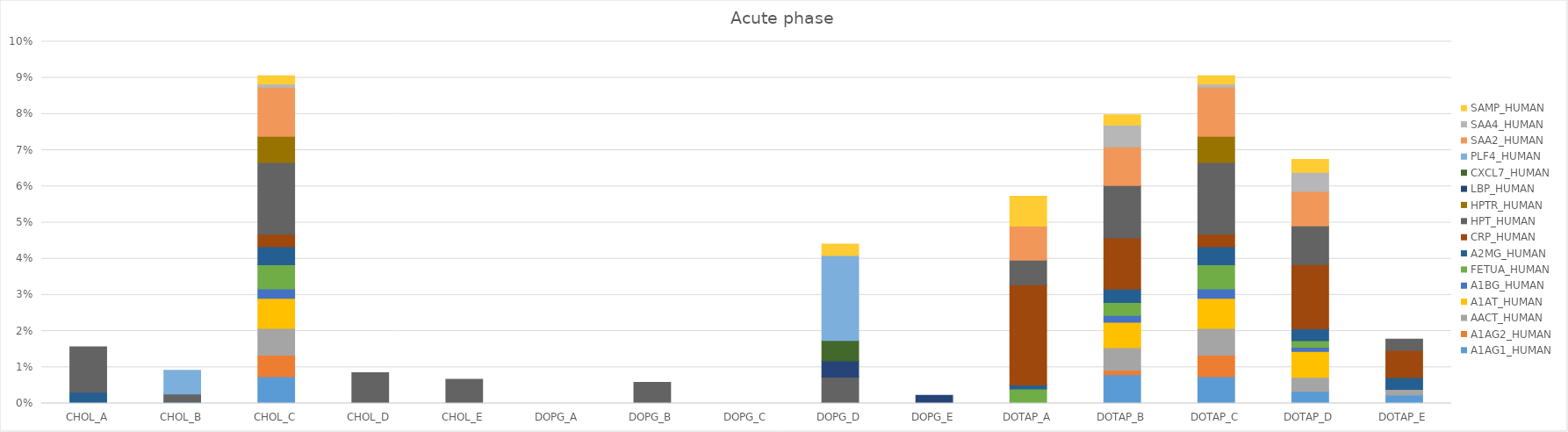
| Category | A1AG1_HUMAN | A1AG2_HUMAN | AACT_HUMAN | A1AT_HUMAN | A1BG_HUMAN | FETUA_HUMAN | A2MG_HUMAN | CRP_HUMAN | HPT_HUMAN | HPTR_HUMAN | LBP_HUMAN | CXCL7_HUMAN | PLF4_HUMAN | SAA2_HUMAN | SAA4_HUMAN | SAMP_HUMAN |
|---|---|---|---|---|---|---|---|---|---|---|---|---|---|---|---|---|
| CHOL_A | 0 | 0 | 0 | 0 | 0 | 0 | 0.003 | 0 | 0.013 | 0 | 0 | 0 | 0 | 0 | 0 | 0 |
| CHOL_B | 0 | 0 | 0 | 0 | 0 | 0 | 0 | 0 | 0.002 | 0 | 0 | 0 | 0.007 | 0 | 0 | 0 |
| CHOL_C | 0.007 | 0.006 | 0.007 | 0.008 | 0.003 | 0.007 | 0.005 | 0.003 | 0.02 | 0.007 | 0 | 0 | 0 | 0.014 | 0.001 | 0.002 |
| CHOL_D | 0 | 0 | 0 | 0 | 0 | 0 | 0 | 0 | 0.009 | 0 | 0 | 0 | 0 | 0 | 0 | 0 |
| CHOL_E | 0 | 0 | 0 | 0 | 0 | 0 | 0 | 0 | 0.007 | 0 | 0 | 0 | 0 | 0 | 0 | 0 |
| DOPG_A | 0 | 0 | 0 | 0 | 0 | 0 | 0 | 0 | 0 | 0 | 0 | 0 | 0 | 0 | 0 | 0 |
| DOPG_B | 0 | 0 | 0 | 0 | 0 | 0 | 0 | 0 | 0.006 | 0 | 0 | 0 | 0 | 0 | 0 | 0 |
| DOPG_C | 0 | 0 | 0 | 0 | 0 | 0 | 0 | 0 | 0 | 0 | 0 | 0 | 0 | 0 | 0 | 0 |
| DOPG_D | 0 | 0 | 0 | 0 | 0 | 0 | 0 | 0 | 0.007 | 0 | 0.004 | 0.006 | 0.023 | 0 | 0 | 0.003 |
| DOPG_E | 0 | 0 | 0 | 0 | 0 | 0 | 0 | 0 | 0 | 0 | 0.002 | 0 | 0 | 0 | 0 | 0 |
| DOTAP_A | 0 | 0 | 0 | 0 | 0 | 0.004 | 0.001 | 0.028 | 0.007 | 0 | 0 | 0 | 0 | 0.009 | 0 | 0.008 |
| DOTAP_B | 0.008 | 0.001 | 0.006 | 0.007 | 0.002 | 0.004 | 0.004 | 0.014 | 0.015 | 0 | 0 | 0 | 0 | 0.011 | 0.006 | 0.003 |
| DOTAP_C | 0.007 | 0.006 | 0.007 | 0.008 | 0.003 | 0.007 | 0.005 | 0.003 | 0.02 | 0.007 | 0 | 0 | 0 | 0.014 | 0.001 | 0.002 |
| DOTAP_D | 0.003 | 0 | 0.004 | 0.007 | 0.001 | 0.002 | 0.003 | 0.018 | 0.011 | 0 | 0 | 0 | 0 | 0.01 | 0.005 | 0.004 |
| DOTAP_E | 0.002 | 0 | 0.002 | 0 | 0 | 0 | 0.003 | 0.008 | 0.003 | 0 | 0 | 0 | 0 | 0 | 0 | 0 |